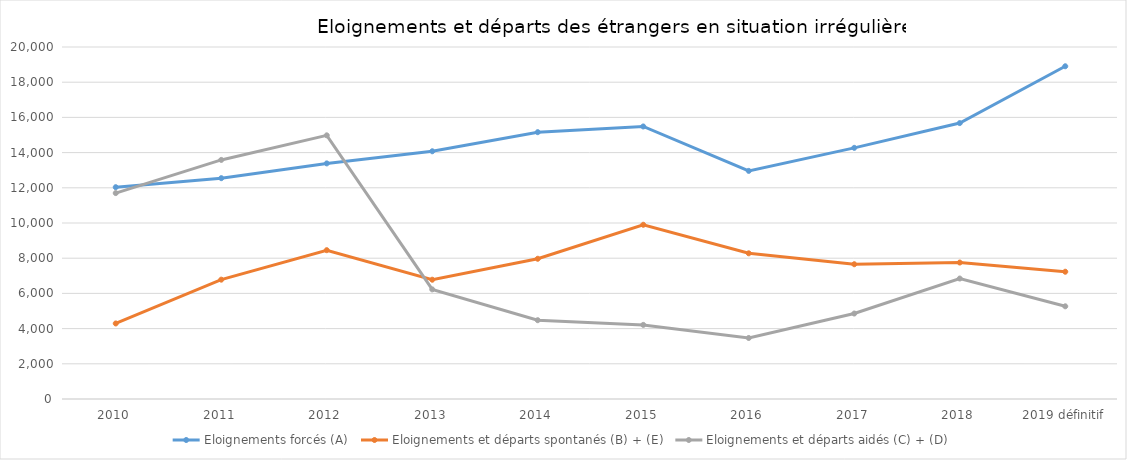
| Category | Eloignements forcés (A) | Eloignements et départs spontanés (B) + (E) | Eloignements et départs aidés (C) + (D) |
|---|---|---|---|
| 2010 | 12034 | 4292 | 11700 |
| 2011 | 12547 | 6781 | 13584 |
| 2012 | 13386 | 8455 | 14981 |
| 2013 | 14076 | 6777 | 6228 |
| 2014 | 15161 | 7968 | 4477 |
| 2015 | 15485 | 9900 | 4211 |
| 2016 | 12961 | 8278 | 3468 |
| 2017 | 14270 | 7657 | 4856 |
| 2018 | 15677 | 7754 | 6845 |
| 2019 définitif | 18906 | 7231 | 5267 |